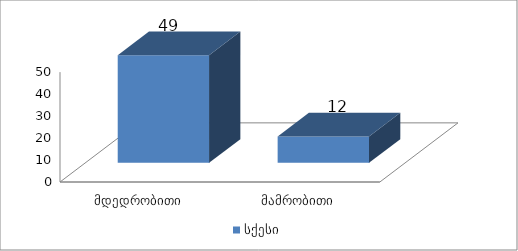
| Category | სქესი |
|---|---|
| მდედრობითი | 49 |
| მამრობითი | 12 |